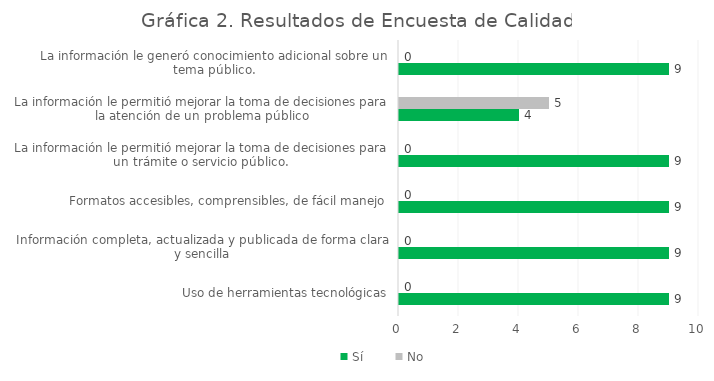
| Category | Sí | No |
|---|---|---|
| Uso de herramientas tecnológicas | 9 | 0 |
| Información completa, actualizada y publicada de forma clara y sencilla | 9 | 0 |
| Formatos accesibles, comprensibles, de fácil manejo | 9 | 0 |
| La información le permitió mejorar la toma de decisiones para un trámite o servicio público. | 9 | 0 |
| La información le permitió mejorar la toma de decisiones para la atención de un problema público | 4 | 5 |
| La información le generó conocimiento adicional sobre un tema público. | 9 | 0 |